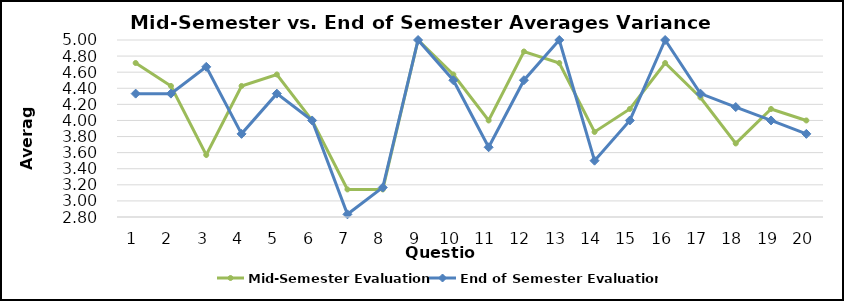
| Category | Mid-Semester Evaluation | End of Semester Evaluation |
|---|---|---|
| 0 | 4.714 | 4.333 |
| 1 | 4.429 | 4.333 |
| 2 | 3.571 | 4.667 |
| 3 | 4.429 | 3.833 |
| 4 | 4.571 | 4.333 |
| 5 | 4 | 4 |
| 6 | 3.143 | 2.833 |
| 7 | 3.143 | 3.167 |
| 8 | 5 | 5 |
| 9 | 4.571 | 4.5 |
| 10 | 4 | 3.667 |
| 11 | 4.857 | 4.5 |
| 12 | 4.714 | 5 |
| 13 | 3.857 | 3.5 |
| 14 | 4.143 | 4 |
| 15 | 4.714 | 5 |
| 16 | 4.286 | 4.333 |
| 17 | 3.714 | 4.167 |
| 18 | 4.143 | 4 |
| 19 | 4 | 3.833 |